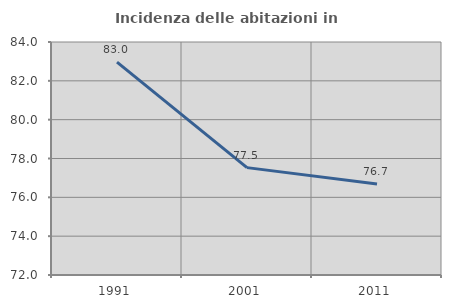
| Category | Incidenza delle abitazioni in proprietà  |
|---|---|
| 1991.0 | 82.965 |
| 2001.0 | 77.53 |
| 2011.0 | 76.691 |